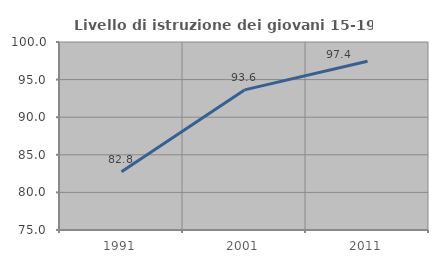
| Category | Livello di istruzione dei giovani 15-19 anni |
|---|---|
| 1991.0 | 82.754 |
| 2001.0 | 93.631 |
| 2011.0 | 97.432 |